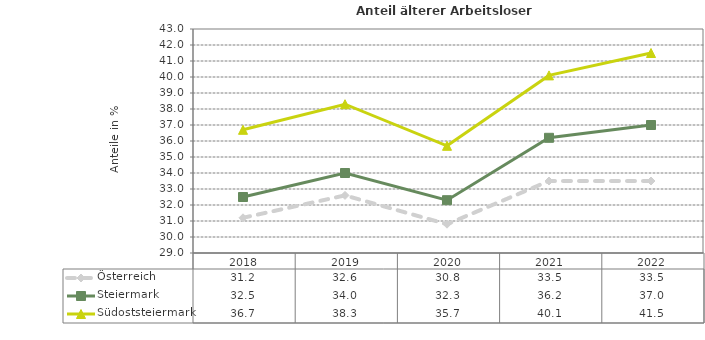
| Category | Österreich | Steiermark | Südoststeiermark |
|---|---|---|---|
| 2022.0 | 33.5 | 37 | 41.5 |
| 2021.0 | 33.5 | 36.2 | 40.1 |
| 2020.0 | 30.8 | 32.3 | 35.7 |
| 2019.0 | 32.6 | 34 | 38.3 |
| 2018.0 | 31.2 | 32.5 | 36.7 |